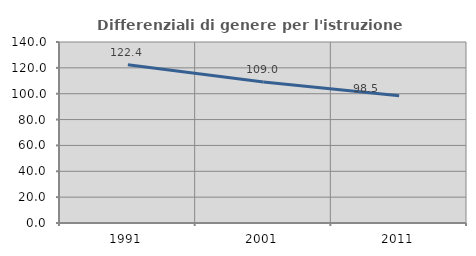
| Category | Differenziali di genere per l'istruzione superiore |
|---|---|
| 1991.0 | 122.388 |
| 2001.0 | 109.002 |
| 2011.0 | 98.465 |